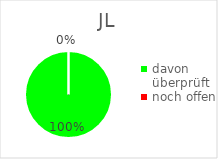
| Category | JL |
|---|---|
| davon überprüft | 16 |
| noch offen | 0 |